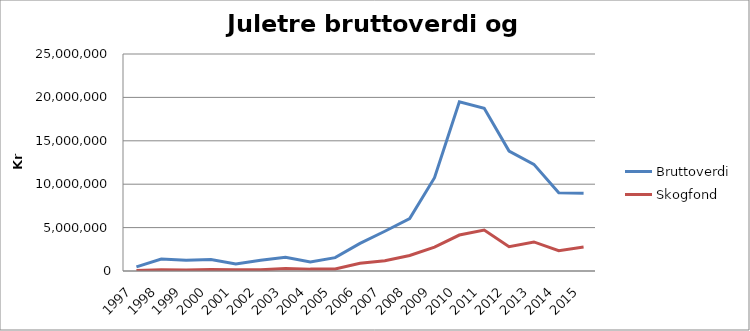
| Category | Bruttoverdi | Skogfond |
|---|---|---|
| 1997 | 478128 | 45580.5 |
| 1998 | 1384218 | 153476 |
| 1999 | 1237443 | 106360 |
| 2000 | 1316769 | 165959 |
| 2001 | 805495 | 142851 |
| 2002 | 1246284 | 138124 |
| 2003 | 1590218 | 286634 |
| 2004 | 1030258 | 216068 |
| 2005 | 1538797 | 234183 |
| 2006 | 3180986 | 891630 |
| 2007 | 4577995 | 1190757 |
| 2008 | 6044162 | 1787092 |
| 2009 | 10749692 | 2751655 |
| 2010 | 19494303 | 4141044 |
| 2011 | 18739117 | 4714438 |
| 2012 | 13810566 | 2798838 |
| 2013 | 12287261 | 3348202 |
| 2014 | 9021558 | 2338630 |
| 2015 | 8954578 | 2757936 |